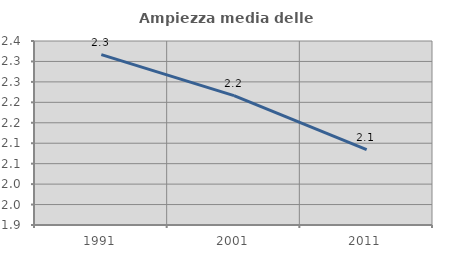
| Category | Ampiezza media delle famiglie |
|---|---|
| 1991.0 | 2.317 |
| 2001.0 | 2.216 |
| 2011.0 | 2.084 |